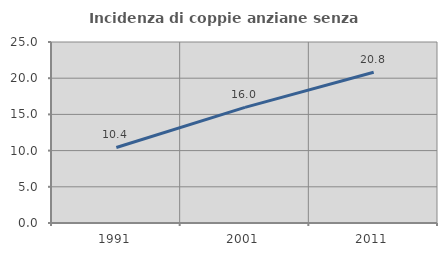
| Category | Incidenza di coppie anziane senza figli  |
|---|---|
| 1991.0 | 10.433 |
| 2001.0 | 15.968 |
| 2011.0 | 20.823 |